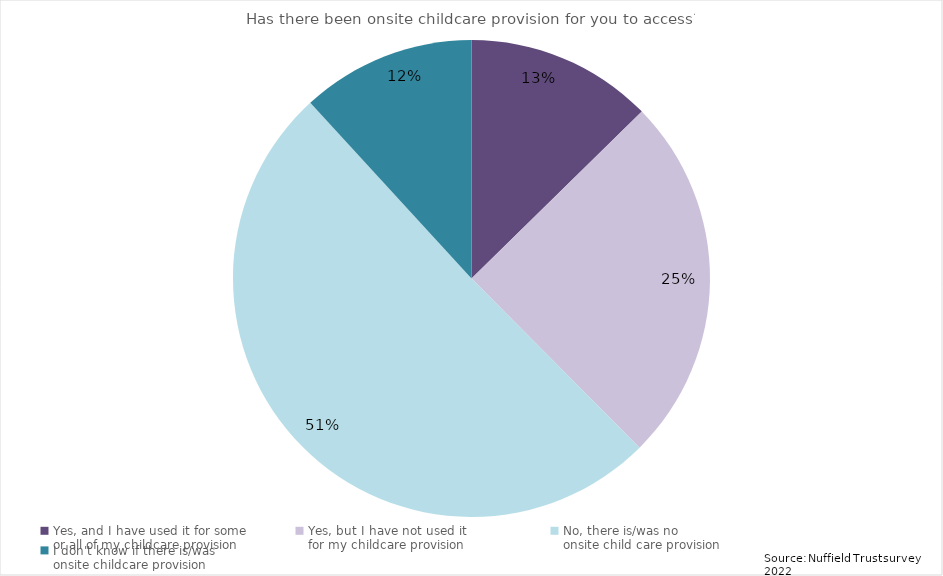
| Category | Series 0 |
|---|---|
| Yes, and I have used it for some 
or all of my childcare provision | 0.127 |
| Yes, but I have not used it 
for my childcare provision | 0.249 |
| No, there is/was no 
onsite child care provision | 0.506 |
| I don't know if there is/was 
onsite childcare provision | 0.118 |